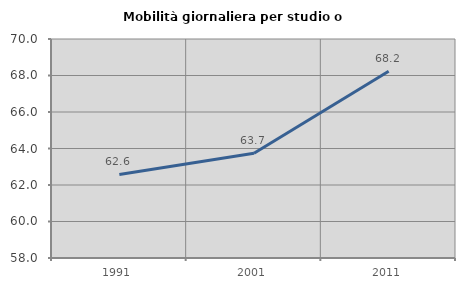
| Category | Mobilità giornaliera per studio o lavoro |
|---|---|
| 1991.0 | 62.58 |
| 2001.0 | 63.742 |
| 2011.0 | 68.23 |